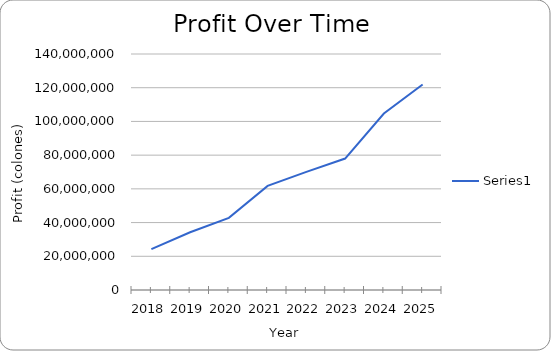
| Category | Series 0 |
|---|---|
| 2018.0 | 24270000 |
| 2019.0 | 34266000 |
| 2020.0 | 42795577.21 |
| 2021.0 | 61741777.21 |
| 2022.0 | 70106497.21 |
| 2023.0 | 77980363.21 |
| 2024.0 | 104659615.81 |
| 2025.0 | 121916017.472 |